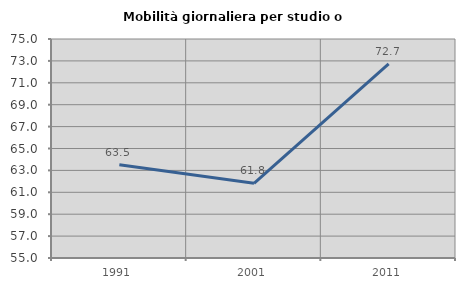
| Category | Mobilità giornaliera per studio o lavoro |
|---|---|
| 1991.0 | 63.512 |
| 2001.0 | 61.822 |
| 2011.0 | 72.719 |